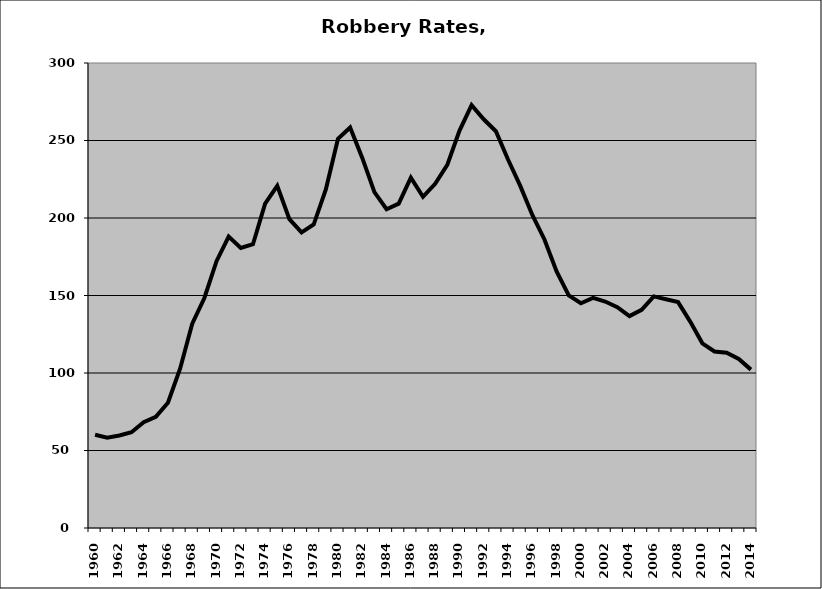
| Category | Robbery |
|---|---|
| 1960.0 | 60.137 |
| 1961.0 | 58.292 |
| 1962.0 | 59.676 |
| 1963.0 | 61.793 |
| 1964.0 | 68.217 |
| 1965.0 | 71.665 |
| 1966.0 | 80.782 |
| 1967.0 | 102.762 |
| 1968.0 | 131.816 |
| 1969.0 | 148.397 |
| 1970.0 | 172.145 |
| 1971.0 | 188.01 |
| 1972.0 | 180.709 |
| 1973.0 | 183.092 |
| 1974.0 | 209.279 |
| 1975.0 | 220.763 |
| 1976.0 | 199.297 |
| 1977.0 | 190.73 |
| 1978.0 | 195.786 |
| 1979.0 | 218.402 |
| 1980.0 | 251.095 |
| 1981.0 | 258.387 |
| 1982.0 | 238.763 |
| 1983.0 | 216.674 |
| 1984.0 | 205.664 |
| 1985.0 | 209.258 |
| 1986.0 | 226.031 |
| 1987.0 | 213.672 |
| 1988.0 | 222.074 |
| 1989.0 | 234.312 |
| 1990.0 | 256.257 |
| 1991.0 | 272.744 |
| 1992.0 | 263.686 |
| 1993.0 | 255.979 |
| 1994.0 | 237.758 |
| 1995.0 | 220.891 |
| 1996.0 | 201.937 |
| 1997.0 | 186.17 |
| 1998.0 | 165.472 |
| 1999.0 | 150.123 |
| 2000.0 | 144.984 |
| 2001.0 | 148.451 |
| 2002.0 | 146.126 |
| 2003.0 | 142.452 |
| 2004.0 | 136.714 |
| 2005.0 | 140.785 |
| 2006.0 | 149.434 |
| 2007.0 | 147.578 |
| 2008.0 | 145.733 |
| 2009.0 | 133.138 |
| 2010.0 | 119.138 |
| 2011.0 | 113.859 |
| 2012.0 | 113.119 |
| 2013.0 | 109.036 |
| 2014.0 | 102.178 |